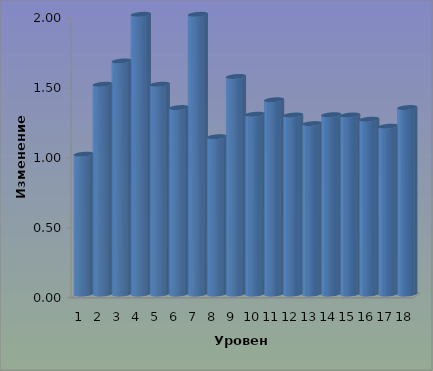
| Category | Series 0 |
|---|---|
| 0 | 1 |
| 1 | 1.5 |
| 2 | 1.667 |
| 3 | 2 |
| 4 | 1.5 |
| 5 | 1.333 |
| 6 | 2 |
| 7 | 1.125 |
| 8 | 1.556 |
| 9 | 1.286 |
| 10 | 1.389 |
| 11 | 1.28 |
| 12 | 1.219 |
| 13 | 1.282 |
| 14 | 1.28 |
| 15 | 1.25 |
| 16 | 1.2 |
| 17 | 1.333 |